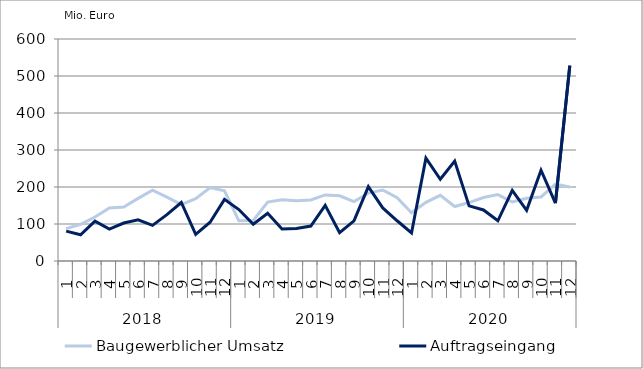
| Category | Baugewerblicher Umsatz | Auftragseingang |
|---|---|---|
| 0 | 87640.529 | 80684.627 |
| 1 | 99259.455 | 70746.763 |
| 2 | 118764.324 | 107538.747 |
| 3 | 143144.178 | 86374.619 |
| 4 | 146070.782 | 102661.329 |
| 5 | 169150.753 | 111287.709 |
| 6 | 191277.885 | 96286.662 |
| 7 | 172425.535 | 125142.495 |
| 8 | 152354.98 | 158112.302 |
| 9 | 168372.756 | 71808.619 |
| 10 | 198558.472 | 104904.147 |
| 11 | 189665.914 | 166653.461 |
| 12 | 108616.605 | 139065.287 |
| 13 | 109331.58 | 99318.609 |
| 14 | 159117.81 | 129002.041 |
| 15 | 165654.287 | 86579.2 |
| 16 | 162976.056 | 87644.362 |
| 17 | 165026.188 | 94463.186 |
| 18 | 178622.938 | 150345.08 |
| 19 | 176074.101 | 76434.317 |
| 20 | 160663.041 | 108444.162 |
| 21 | 183589.485 | 201122.697 |
| 22 | 191777.213 | 143514.792 |
| 23 | 170885.223 | 108780.022 |
| 24 | 130445.562 | 75891.481 |
| 25 | 158433.655 | 277923.85 |
| 26 | 177529.832 | 220973.626 |
| 27 | 147259.799 | 269936.091 |
| 28 | 157965.891 | 149072.895 |
| 29 | 171647.778 | 137984.76 |
| 30 | 179530.732 | 108645.965 |
| 31 | 159480.457 | 190771.468 |
| 32 | 169638.111 | 136988.906 |
| 33 | 173040.053 | 245341.603 |
| 34 | 207619.085 | 156647.224 |
| 35 | 199947.086 | 528166.004 |